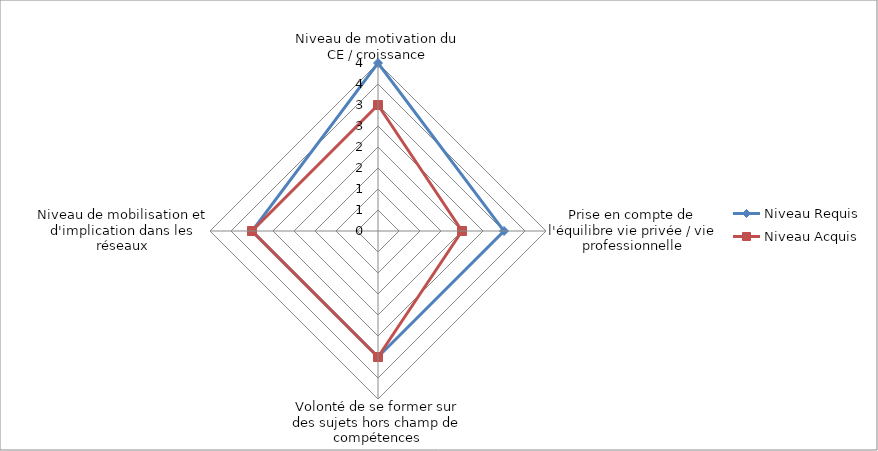
| Category | Niveau Requis | Niveau Acquis |
|---|---|---|
| Niveau de motivation du CE / croissance | 4 | 3 |
| Prise en compte de l'équilibre vie privée / vie professionnelle | 3 | 2 |
| Volonté de se former sur des sujets hors champ de compétences | 3 | 3 |
| Niveau de mobilisation et d'implication dans les réseaux | 3 | 3 |